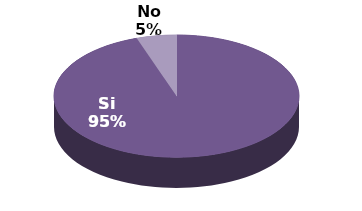
| Category | Series 1 |
|---|---|
| Si | 18 |
| No | 1 |